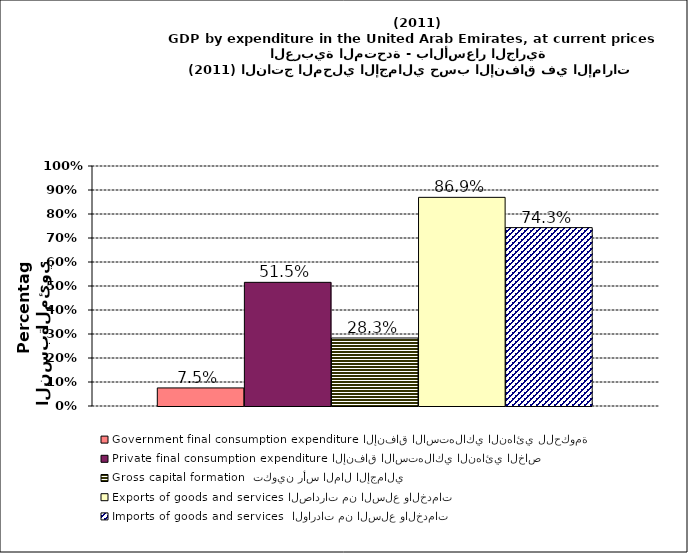
| Category | Government final consumption expenditure الإنفاق الاستهلاكي النهائي للحكومة | Private final consumption expenditure الإنفاق الاستهلاكي النهائي الخاص | Gross capital formation  تكوين رأس المال الإجمالي | Exports of goods and services الصادرات من السلع والخدمات | Imports of goods and services  الواردات من السلع والخدمات |
|---|---|---|---|---|---|
| 0 | 0.075 | 0.515 | 0.283 | 0.869 | 0.743 |